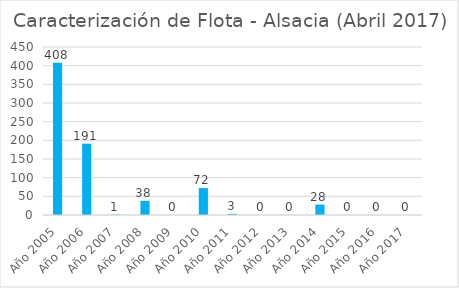
| Category | Series 0 |
|---|---|
| Año 2005 | 408 |
| Año 2006 | 191 |
| Año 2007 | 1 |
| Año 2008 | 38 |
| Año 2009 | 0 |
| Año 2010 | 72 |
| Año 2011 | 3 |
| Año 2012 | 0 |
| Año 2013 | 0 |
| Año 2014 | 28 |
| Año 2015 | 0 |
| Año 2016 | 0 |
| Año 2017 | 0 |